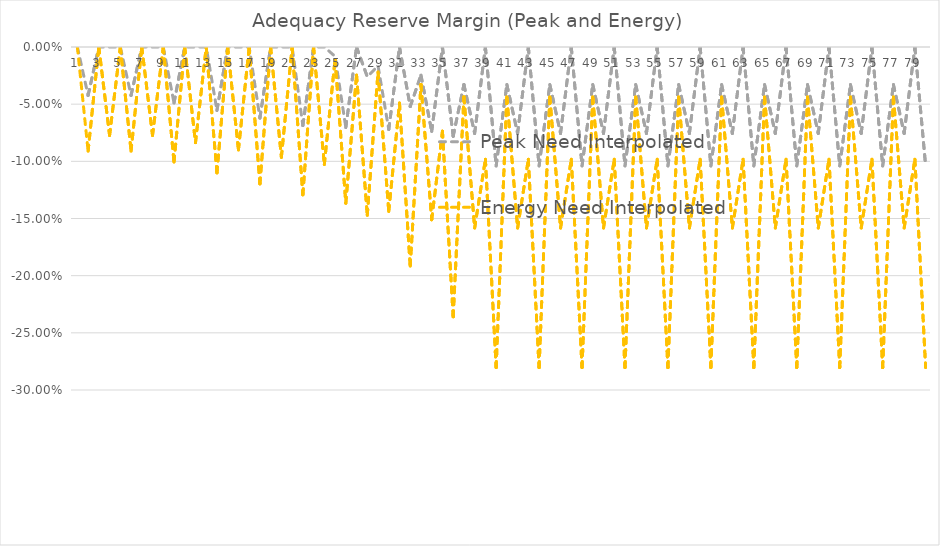
| Category | Peak Need Interpolated | Energy Need Interpolated |
|---|---|---|
| 0 | 0 | 0 |
| 1 | -0.042 | -0.091 |
| 2 | 0 | 0 |
| 3 | 0 | -0.077 |
| 4 | 0 | 0 |
| 5 | -0.042 | -0.091 |
| 6 | 0 | 0 |
| 7 | 0 | -0.077 |
| 8 | 0 | 0 |
| 9 | -0.049 | -0.101 |
| 10 | 0 | 0 |
| 11 | 0 | -0.084 |
| 12 | 0 | 0 |
| 13 | -0.056 | -0.11 |
| 14 | 0 | 0 |
| 15 | 0 | -0.09 |
| 16 | 0 | 0 |
| 17 | -0.062 | -0.12 |
| 18 | 0 | 0 |
| 19 | 0 | -0.096 |
| 20 | 0 | 0 |
| 21 | -0.069 | -0.129 |
| 22 | 0 | 0 |
| 23 | 0 | -0.103 |
| 24 | -0.008 | -0.011 |
| 25 | -0.07 | -0.137 |
| 26 | 0 | -0.025 |
| 27 | -0.026 | -0.147 |
| 28 | -0.016 | -0.022 |
| 29 | -0.072 | -0.144 |
| 30 | 0 | -0.049 |
| 31 | -0.052 | -0.192 |
| 32 | -0.025 | -0.033 |
| 33 | -0.074 | -0.151 |
| 34 | 0 | -0.074 |
| 35 | -0.078 | -0.236 |
| 36 | -0.033 | -0.044 |
| 37 | -0.076 | -0.158 |
| 38 | 0 | -0.098 |
| 39 | -0.104 | -0.28 |
| 40 | -0.033 | -0.044 |
| 41 | -0.076 | -0.158 |
| 42 | 0 | -0.098 |
| 43 | -0.104 | -0.28 |
| 44 | -0.033 | -0.044 |
| 45 | -0.076 | -0.158 |
| 46 | 0 | -0.098 |
| 47 | -0.104 | -0.28 |
| 48 | -0.033 | -0.044 |
| 49 | -0.076 | -0.158 |
| 50 | 0 | -0.098 |
| 51 | -0.104 | -0.28 |
| 52 | -0.033 | -0.044 |
| 53 | -0.076 | -0.158 |
| 54 | 0 | -0.098 |
| 55 | -0.104 | -0.28 |
| 56 | -0.033 | -0.044 |
| 57 | -0.076 | -0.158 |
| 58 | 0 | -0.098 |
| 59 | -0.104 | -0.28 |
| 60 | -0.033 | -0.044 |
| 61 | -0.076 | -0.158 |
| 62 | 0 | -0.098 |
| 63 | -0.104 | -0.28 |
| 64 | -0.033 | -0.044 |
| 65 | -0.076 | -0.158 |
| 66 | 0 | -0.098 |
| 67 | -0.104 | -0.28 |
| 68 | -0.033 | -0.044 |
| 69 | -0.076 | -0.158 |
| 70 | 0 | -0.098 |
| 71 | -0.104 | -0.28 |
| 72 | -0.033 | -0.044 |
| 73 | -0.076 | -0.158 |
| 74 | 0 | -0.098 |
| 75 | -0.104 | -0.28 |
| 76 | -0.033 | -0.044 |
| 77 | -0.076 | -0.158 |
| 78 | 0 | -0.098 |
| 79 | -0.104 | -0.28 |